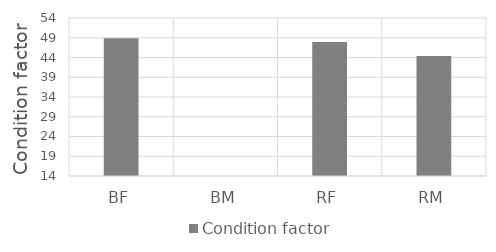
| Category | Condition factor |
|---|---|
| BF | 48.9 |
| BM | 0 |
| RF | 47.9 |
| RM | 44.4 |